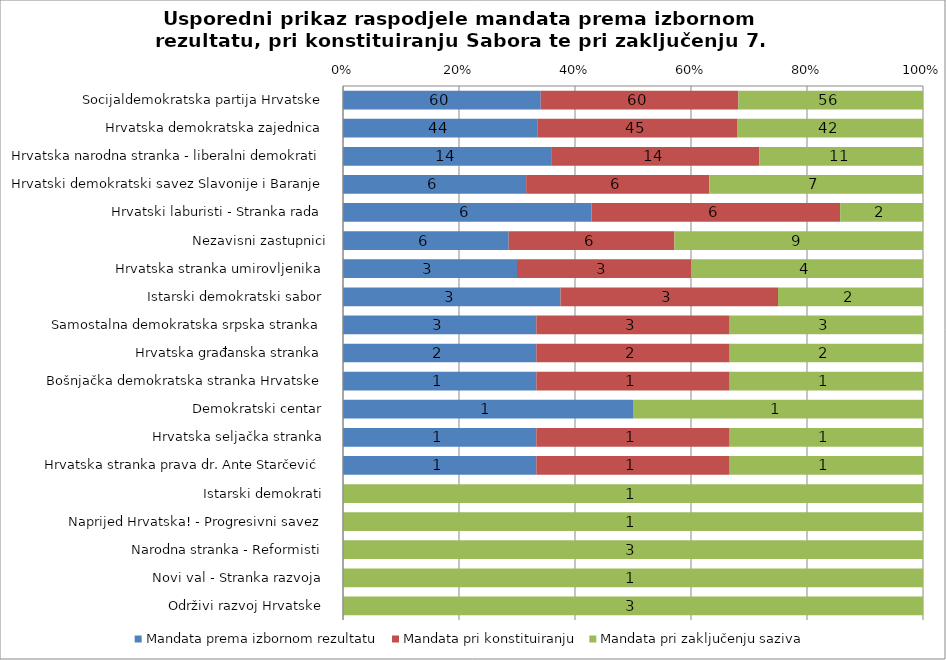
| Category | Mandata prema izbornom rezultatu | Mandata pri konstituiranju | Mandata pri zaključenju saziva |
|---|---|---|---|
| Socijaldemokratska partija Hrvatske  | 60 | 60 | 56 |
| Hrvatska demokratska zajednica  | 44 | 45 | 42 |
| Hrvatska narodna stranka - liberalni demokrati  | 14 | 14 | 11 |
| Hrvatski demokratski savez Slavonije i Baranje  | 6 | 6 | 7 |
| Hrvatski laburisti - Stranka rada  | 6 | 6 | 2 |
| Nezavisni zastupnici | 6 | 6 | 9 |
| Hrvatska stranka umirovljenika  | 3 | 3 | 4 |
| Istarski demokratski sabor  | 3 | 3 | 2 |
| Samostalna demokratska srpska stranka  | 3 | 3 | 3 |
| Hrvatska građanska stranka  | 2 | 2 | 2 |
| Bošnjačka demokratska stranka Hrvatske  | 1 | 1 | 1 |
| Demokratski centar  | 1 | 0 | 1 |
| Hrvatska seljačka stranka  | 1 | 1 | 1 |
| Hrvatska stranka prava dr. Ante Starčević  | 1 | 1 | 1 |
| Istarski demokrati  | 0 | 0 | 1 |
| Naprijed Hrvatska! - Progresivni savez  | 0 | 0 | 1 |
| Narodna stranka - Reformisti  | 0 | 0 | 3 |
| Novi val - Stranka razvoja  | 0 | 0 | 1 |
| Održivi razvoj Hrvatske  | 0 | 0 | 3 |